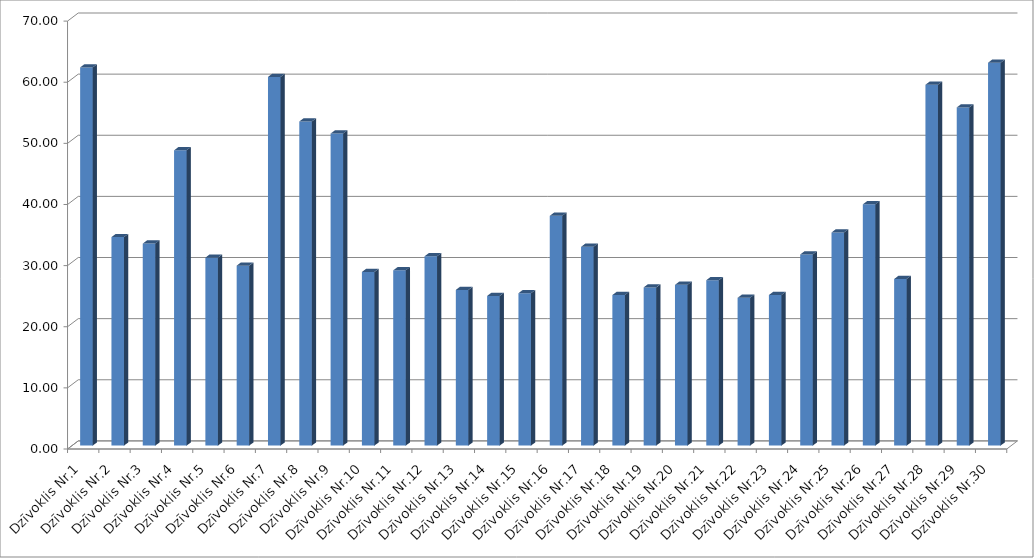
| Category | Series 0 |
|---|---|
| Dzīvoklis Nr.1 | 61.87 |
| Dzīvoklis Nr.2 | 34.109 |
| Dzīvoklis Nr.3 | 33.049 |
| Dzīvoklis Nr.4 | 48.309 |
| Dzīvoklis Nr.5 | 30.751 |
| Dzīvoklis Nr.6 | 29.444 |
| Dzīvoklis Nr.7 | 60.315 |
| Dzīvoklis Nr.8 | 53.028 |
| Dzīvoklis Nr.9 | 51.052 |
| Dzīvoklis Nr.10 | 28.412 |
| Dzīvoklis Nr.11 | 28.672 |
| Dzīvoklis Nr.12 | 30.969 |
| Dzīvoklis Nr.13 | 25.472 |
| Dzīvoklis Nr.14 | 24.485 |
| Dzīvoklis Nr.15 | 24.932 |
| Dzīvoklis Nr.16 | 37.59 |
| Dzīvoklis Nr.17 | 32.521 |
| Dzīvoklis Nr.18 | 24.628 |
| Dzīvoklis Nr.19 | 25.883 |
| Dzīvoklis Nr.20 | 26.304 |
| Dzīvoklis Nr.21 | 27.063 |
| Dzīvoklis Nr.22 | 24.179 |
| Dzīvoklis Nr.23 | 24.633 |
| Dzīvoklis Nr.24 | 31.268 |
| Dzīvoklis Nr.25 | 34.869 |
| Dzīvoklis Nr.26 | 39.469 |
| Dzīvoklis Nr.27 | 27.254 |
| Dzīvoklis Nr.28 | 59.035 |
| Dzīvoklis Nr.29 | 55.324 |
| Dzīvoklis Nr.30 | 62.641 |